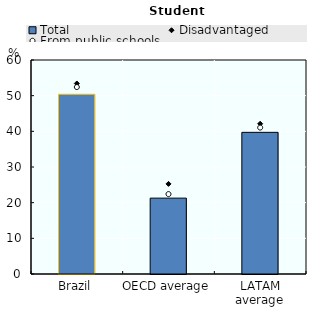
| Category | Total |
|---|---|
| Brazil | 50.39 |
| OECD average | 21.27 |
| LATAM average | 39.717 |